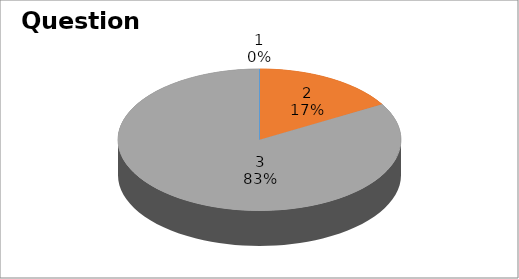
| Category | Series 0 |
|---|---|
| 0 | 0 |
| 1 | 10 |
| 2 | 50 |